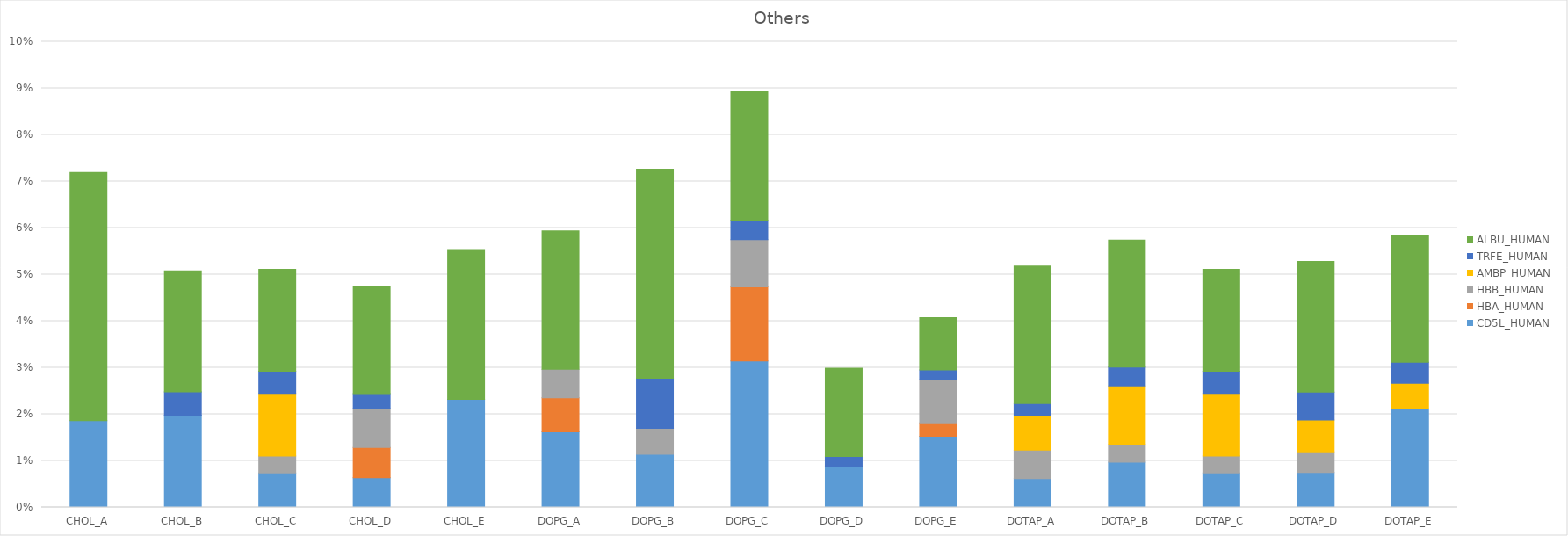
| Category | CD5L_HUMAN | HBA_HUMAN | HBB_HUMAN | AMBP_HUMAN | TRFE_HUMAN | ALBU_HUMAN |
|---|---|---|---|---|---|---|
| CHOL_A | 0.019 | 0 | 0 | 0 | 0 | 0.053 |
| CHOL_B | 0.02 | 0 | 0 | 0 | 0.005 | 0.026 |
| CHOL_C | 0.007 | 0 | 0.004 | 0.013 | 0.005 | 0.022 |
| CHOL_D | 0.006 | 0.007 | 0.008 | 0 | 0.003 | 0.023 |
| CHOL_E | 0.023 | 0 | 0 | 0 | 0 | 0.032 |
| DOPG_A | 0.016 | 0.007 | 0.006 | 0 | 0 | 0.03 |
| DOPG_B | 0.011 | 0 | 0.006 | 0 | 0.011 | 0.045 |
| DOPG_C | 0.031 | 0.016 | 0.01 | 0 | 0.004 | 0.028 |
| DOPG_D | 0.009 | 0 | 0 | 0 | 0.002 | 0.019 |
| DOPG_E | 0.015 | 0.003 | 0.009 | 0 | 0.002 | 0.011 |
| DOTAP_A | 0.006 | 0 | 0.006 | 0.007 | 0.003 | 0.03 |
| DOTAP_B | 0.01 | 0 | 0.004 | 0.013 | 0.004 | 0.027 |
| DOTAP_C | 0.007 | 0 | 0.004 | 0.013 | 0.005 | 0.022 |
| DOTAP_D | 0.007 | 0 | 0.004 | 0.007 | 0.006 | 0.028 |
| DOTAP_E | 0.021 | 0 | 0 | 0.005 | 0.005 | 0.027 |